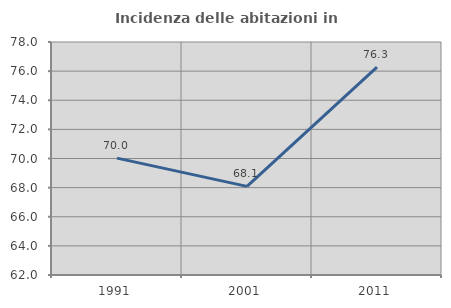
| Category | Incidenza delle abitazioni in proprietà  |
|---|---|
| 1991.0 | 70.023 |
| 2001.0 | 68.085 |
| 2011.0 | 76.281 |